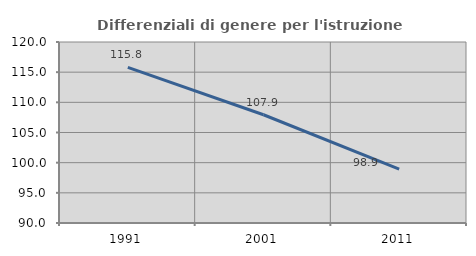
| Category | Differenziali di genere per l'istruzione superiore |
|---|---|
| 1991.0 | 115.789 |
| 2001.0 | 107.94 |
| 2011.0 | 98.919 |